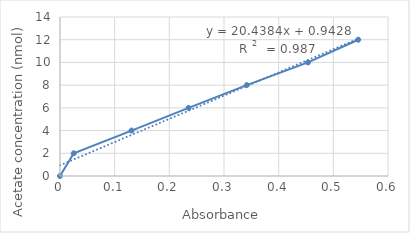
| Category | Series 0 |
|---|---|
| 0.0 | 0 |
| 0.02515 | 2 |
| 0.13085 | 4 |
| 0.23525 | 6 |
| 0.3416 | 8 |
| 0.45365 | 10 |
| 0.54555 | 12 |